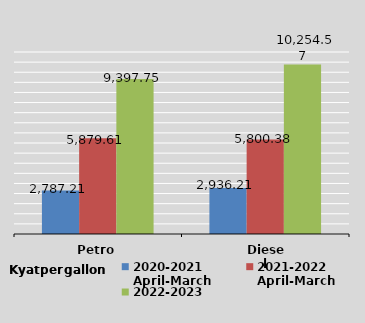
| Category | 2020-2021
April-March
 | 2021-2022
April-March
 | 2022-2023
April-June

 |
|---|---|---|---|
| Petro | 2787.211 | 5879.614 | 9397.751 |
| Diesel | 2936.21 | 5800.381 | 10254.574 |